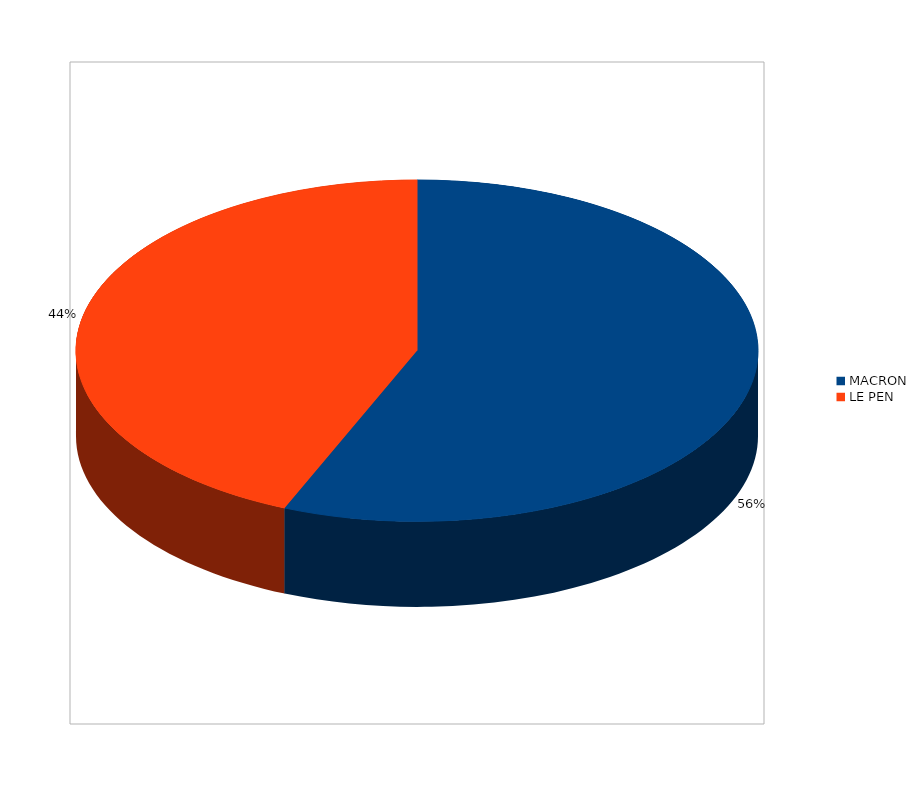
| Category | Series 0 |
|---|---|
| MACRON | 3077 |
| LE PEN | 2384 |